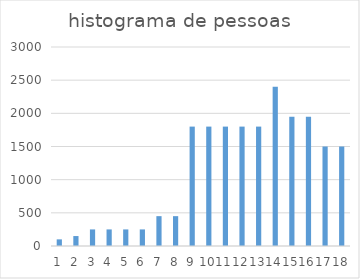
| Category | Series 0 |
|---|---|
| 0 | 100 |
| 1 | 150 |
| 2 | 250 |
| 3 | 250 |
| 4 | 250 |
| 5 | 250 |
| 6 | 450 |
| 7 | 450 |
| 8 | 1800 |
| 9 | 1800 |
| 10 | 1800 |
| 11 | 1800 |
| 12 | 1800 |
| 13 | 2400 |
| 14 | 1950 |
| 15 | 1950 |
| 16 | 1500 |
| 17 | 1500 |